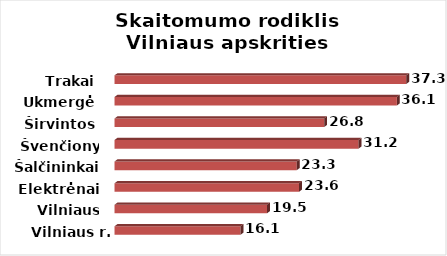
| Category | Series 0 |
|---|---|
| Vilniaus r. | 16.1 |
| Vilniaus m. | 19.5 |
| Elektrėnai | 23.6 |
| Šalčininkai | 23.3 |
| Švenčionys | 31.2 |
| Širvintos | 26.8 |
| Ukmergė | 36.1 |
| Trakai | 37.3 |